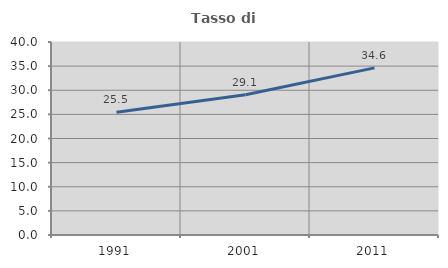
| Category | Tasso di occupazione   |
|---|---|
| 1991.0 | 25.46 |
| 2001.0 | 29.056 |
| 2011.0 | 34.634 |